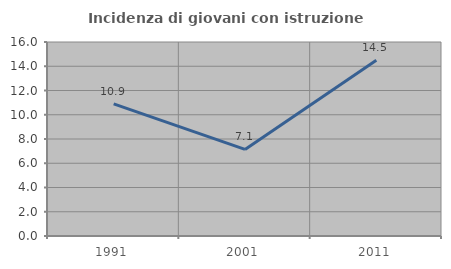
| Category | Incidenza di giovani con istruzione universitaria |
|---|---|
| 1991.0 | 10.891 |
| 2001.0 | 7.143 |
| 2011.0 | 14.504 |